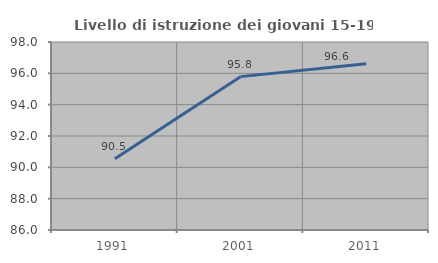
| Category | Livello di istruzione dei giovani 15-19 anni |
|---|---|
| 1991.0 | 90.541 |
| 2001.0 | 95.789 |
| 2011.0 | 96.61 |